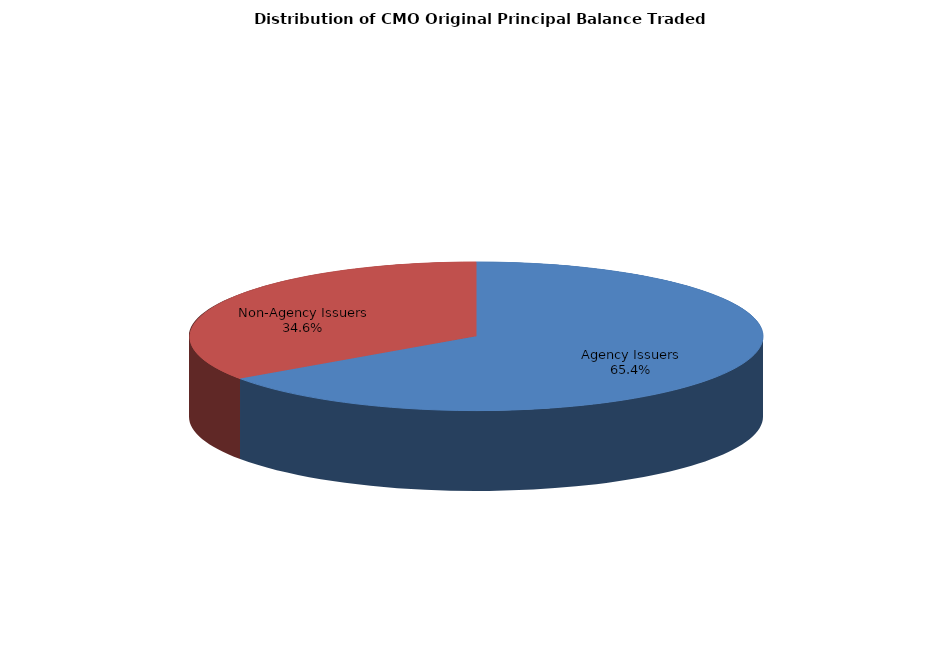
| Category | Series 0 |
|---|---|
| Agency Issuers | 6119596455.723 |
| Non-Agency Issuers | 3244298016.009 |